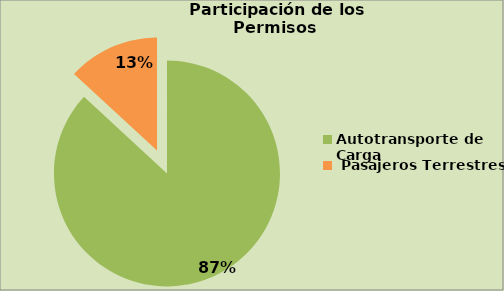
| Category | Series 0 |
|---|---|
| Autotransporte de Carga  | 86.874 |
|  Pasajeros Terrestres | 13.126 |